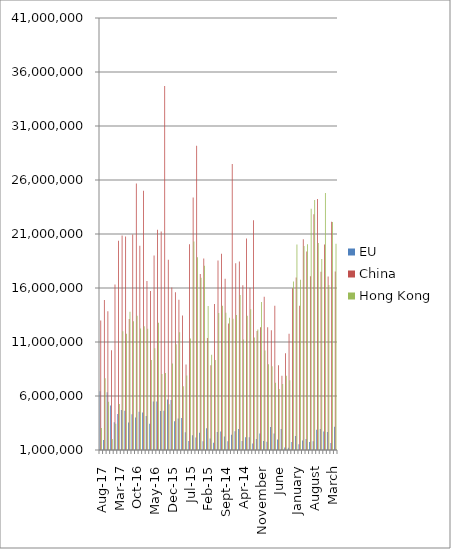
| Category | EU | China  | Hong Kong |
|---|---|---|---|
| Aug-17 | 6436902 | 12986863 | 3038463 |
| Jul-17 | 1917806 | 14879464 | 7636089 |
| Jun-17 | 6344826 | 13836510 | 5463022 |
| May-17 | 5126138 | 10244233 | 2025983 |
| Apr-17 | 3563463 | 16314413 | 3427824 |
| Mar-17 | 4328398 | 20367409 | 5250119 |
| Feb-17 | 4705418 | 20856796 | 11996360 |
| Jan-17 | 4634122 | 20775379 | 11755312 |
| Dec-16 | 3535115 | 13127387 | 13792252 |
| Nov-16 | 4301122 | 20944692 | 12916602 |
| Oct-16 | 4009896 | 25665367 | 13424572 |
| Sep-16 | 4547373 | 19921087 | 12247285 |
| Aug-16 | 4482766 | 25011782 | 12467899 |
| Jul-16 | 4142050 | 16654538 | 12216421 |
| Jun-16 | 3425673 | 15723868 | 9328502 |
| May-16 | 5481026 | 19011945 | 10417586 |
| Apr-16 | 5493103 | 21389069 | 12783949 |
| Mar-16 | 4601443 | 21238180 | 8045193 |
| Feb-16 | 4645301 | 34692799 | 8127956 |
| Jan-16 | 5676253 | 18609369 | 5225585 |
| Dec-15 | 5633739 | 16050304 | 9001127 |
| Nov-15 | 3653595 | 15614028 | 10782451 |
| Oct-15 | 3908135 | 14920598 | 11902041 |
| Sep-15 | 3955053 | 13444791 | 6900644 |
| Aug-15 | 2638287 | 8928230 | 7899961 |
| Jul-15 | 1839630 | 20053716 | 11332757 |
| Jun-15 | 2372118 | 24372058 | 20316047 |
| May-15 | 2146207 | 29168948 | 18849426 |
| Apr-15 | 2592527 | 17297919 | 16950664 |
| Mar-15 | 1804966 | 18722752 | 18054918 |
| Feb-15 | 3005880 | 11376464 | 14338410 |
| Jan-15 | 2059966 | 8839333 | 9816039 |
| Dec-14 | 1677897 | 14508829 | 9323814 |
| Nov-14 | 2675499 | 18543154 | 13696052 |
| Oct-14 | 2703857 | 19160159 | 14362342 |
| Sep-14 | 2241750 | 16855315 | 13708458 |
| Aug-14 | 1815307 | 12701698 | 13256803 |
| Jul-14 | 2408775 | 27492198 | 13141519 |
| Jun-14 | 2725218 | 18285335 | 13501334 |
| May-14 | 2933629 | 18458321 | 15359218 |
| Apr-14 | 1843773 | 16250633 | 11228546 |
| Mar-14 | 2175062 | 20583564 | 13424681 |
| February | 2172031 | 16014877 | 14029194 |
| January | 1603480 | 22273760 | 11421386 |
| December | 2012804 | 12029832 | 12159071 |
| November | 2530866 | 12376993 | 14713711 |
| October | 1837905 | 15196883 | 10219057 |
| September | 1770759 | 12360450 | 8946295 |
| August | 3120814 | 12084187 | 8751947 |
| July | 2519362 | 14352211 | 7223925 |
| June | 1965766 | 8857868 | 6643899 |
| May | 2948266 | 7883665 | 7119069 |
| April | 1236272 | 9949309 | 7867921 |
| March | 1197755 | 11759283 | 7455678 |
| February | 1735231 | 15979037 | 16606797 |
| January | 2302749 | 16965223 | 20019240 |
| December | 1530842 | 14355344 | 16759339 |
| November | 1888182 | 20506929 | 19886975 |
| October | 2024671 | 19383048 | 20052240 |
| September | 1737652 | 17096567 | 23328052 |
| August | 1800761 | 22838535 | 24156982 |
| July | 2872365 | 24232305 | 20164613 |
| June | 2951500 | 17514033 | 18682448 |
| May | 2721121 | 20020969 | 24805010 |
| April | 2657795 | 17058664 | 16281296 |
| March | 1655906 | 22125422 | 22106222 |
| February | 3144860 | 17530823 | 20087977 |